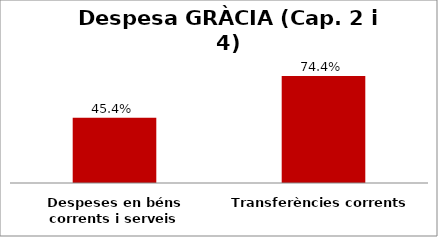
| Category | Series 0 |
|---|---|
| Despeses en béns corrents i serveis | 0.454 |
| Transferències corrents | 0.744 |